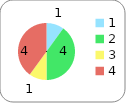
| Category | Series 0 |
|---|---|
| 0 | 1 |
| 1 | 4 |
| 2 | 1 |
| 3 | 4 |